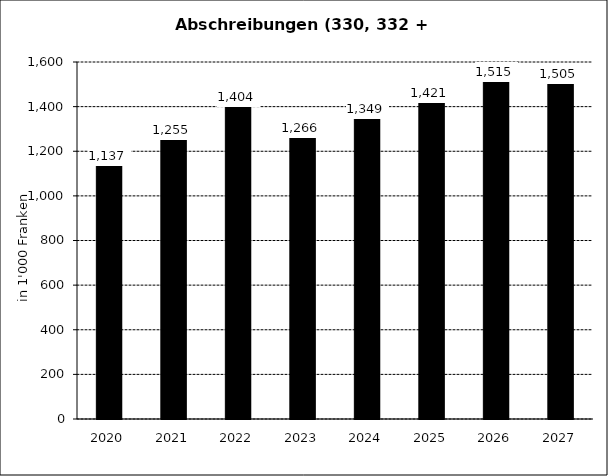
| Category | Abschreibungen (330, 332 + 366) |
|---|---|
| 2020.0 | 1137 |
| 2021.0 | 1255 |
| 2022.0 | 1404 |
| 2023.0 | 1266 |
| 2024.0 | 1348.88 |
| 2025.0 | 1420.926 |
| 2026.0 | 1514.971 |
| 2027.0 | 1505.497 |